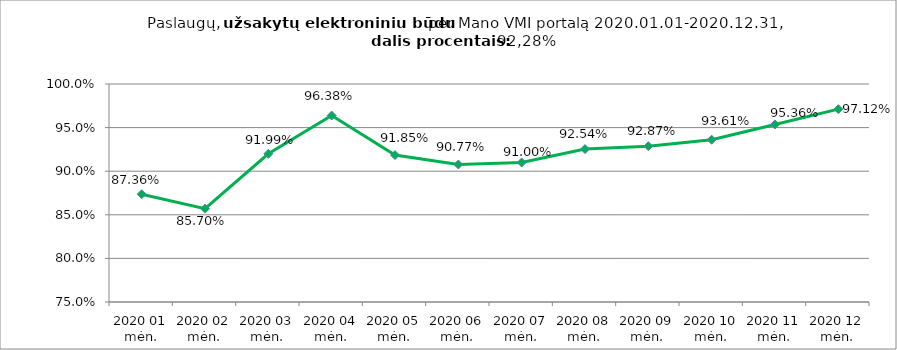
| Category | Elektroniniu būdu užsakytų paslaugų dalis procentais (lyginant su visomis Mano VMI portale užsakytomis paslaugomis) |
|---|---|
| 2020 01 mėn. | 0.874 |
| 2020 02 mėn. | 0.857 |
| 2020 03 mėn. | 0.92 |
| 2020 04 mėn. | 0.964 |
| 2020 05 mėn. | 0.918 |
| 2020 06 mėn. | 0.908 |
| 2020 07 mėn. | 0.91 |
| 2020 08 mėn. | 0.925 |
| 2020 09 mėn. | 0.929 |
| 2020 10 mėn. | 0.936 |
| 2020 11 mėn. | 0.954 |
| 2020 12 mėn. | 0.971 |